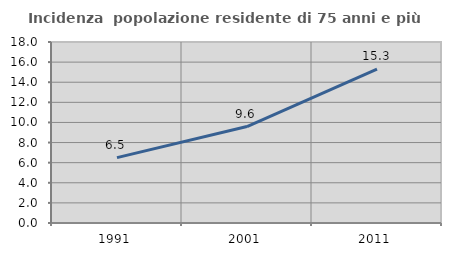
| Category | Incidenza  popolazione residente di 75 anni e più |
|---|---|
| 1991.0 | 6.504 |
| 2001.0 | 9.596 |
| 2011.0 | 15.31 |